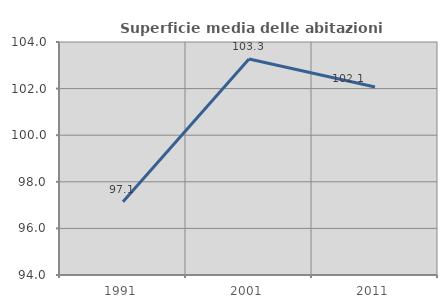
| Category | Superficie media delle abitazioni occupate |
|---|---|
| 1991.0 | 97.147 |
| 2001.0 | 103.272 |
| 2011.0 | 102.071 |